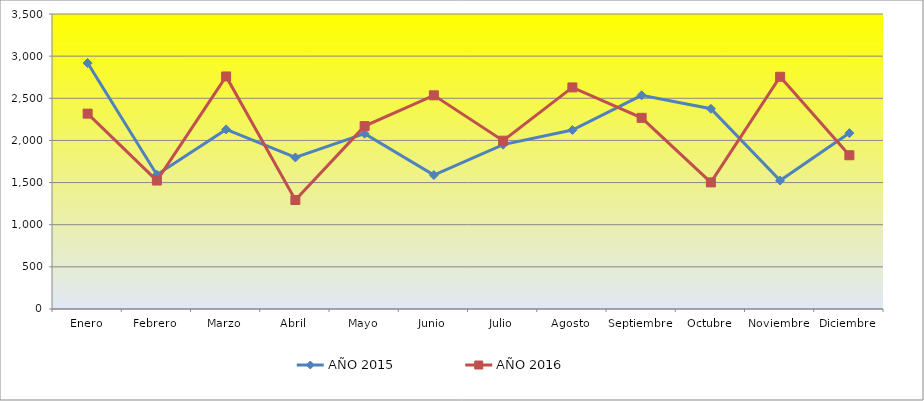
| Category | AÑO 2015 | AÑO 2016 |
|---|---|---|
| Enero | 2918 | 2318 |
| Febrero | 1593 | 1524 |
| Marzo | 2131 | 2759 |
| Abril | 1798 | 1293 |
| Mayo | 2080 | 2170 |
| Junio | 1589 | 2535 |
| Julio | 1950 | 1997 |
| Agosto | 2123 | 2629 |
| Septiembre | 2535 | 2268 |
| Octubre | 2376 | 1502 |
| Noviembre | 1524 | 2755 |
| Diciembre | 2087 | 1824 |